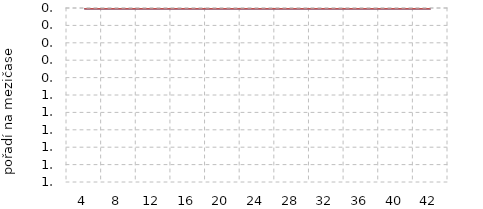
| Category | Series 2 | Series 1 | Series 0 |
|---|---|---|---|
| 4.0 | 0 | 0 | 0 |
| 8.0 | 0 | 0 | 0 |
| 12.0 | 0 | 0 | 0 |
| 16.0 | 0 | 0 | 0 |
| 20.0 | 0 | 0 | 0 |
| 24.0 | 0 | 0 | 0 |
| 28.0 | 0 | 0 | 0 |
| 32.0 | 0 | 0 | 0 |
| 36.0 | 0 | 0 | 0 |
| 40.0 | 0 | 0 | 0 |
| 42.0 | 0 | 0 | 0 |